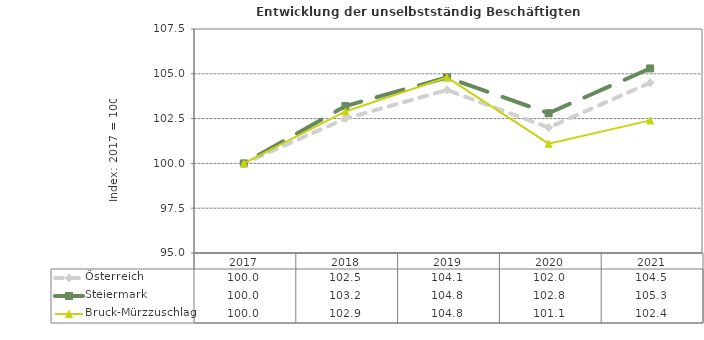
| Category | Österreich | Steiermark | Bruck-Mürzzuschlag |
|---|---|---|---|
| 2021.0 | 104.5 | 105.3 | 102.4 |
| 2020.0 | 102 | 102.8 | 101.1 |
| 2019.0 | 104.1 | 104.8 | 104.8 |
| 2018.0 | 102.5 | 103.2 | 102.9 |
| 2017.0 | 100 | 100 | 100 |